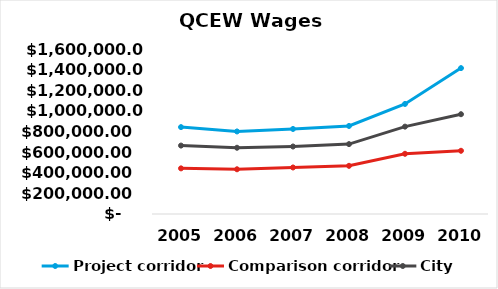
| Category | Project corridor | Comparison corridor | City |
|---|---|---|---|
| 2005.0 | 842547 | 442547 | 663497.167 |
| 2006.0 | 800419.65 | 433696.06 | 642414.938 |
| 2007.0 | 824592.323 | 451130.642 | 654544.462 |
| 2008.0 | 853782.892 | 467100.666 | 677715.336 |
| 2009.0 | 1067228.615 | 583875.833 | 847144.17 |
| 2010.0 | 1414718.252 | 613069.625 | 967640.837 |